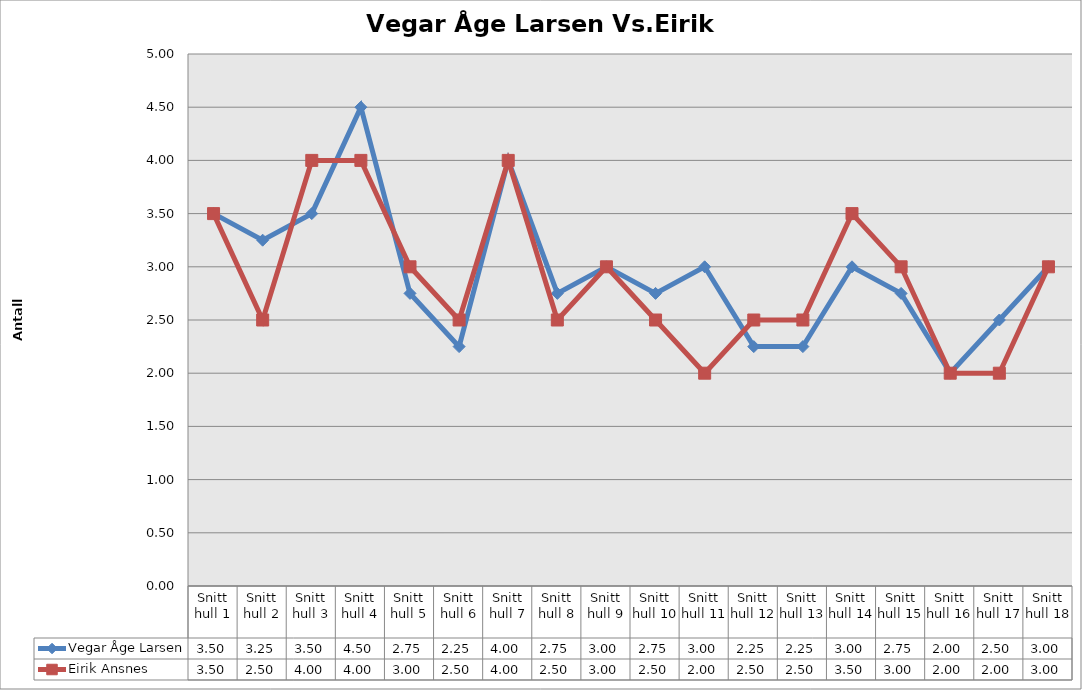
| Category | Vegar Åge Larsen | Eirik Ansnes |
|---|---|---|
| Snitt hull 1 | 3.5 | 3.5 |
| Snitt hull 2 | 3.25 | 2.5 |
| Snitt hull 3 | 3.5 | 4 |
| Snitt hull 4 | 4.5 | 4 |
| Snitt hull 5 | 2.75 | 3 |
| Snitt hull 6 | 2.25 | 2.5 |
| Snitt hull 7 | 4 | 4 |
| Snitt hull 8 | 2.75 | 2.5 |
| Snitt hull 9 | 3 | 3 |
| Snitt hull 10 | 2.75 | 2.5 |
| Snitt hull 11 | 3 | 2 |
| Snitt hull 12 | 2.25 | 2.5 |
| Snitt hull 13 | 2.25 | 2.5 |
| Snitt hull 14 | 3 | 3.5 |
| Snitt hull 15 | 2.75 | 3 |
| Snitt hull 16 | 2 | 2 |
| Snitt hull 17 | 2.5 | 2 |
| Snitt hull 18 | 3 | 3 |